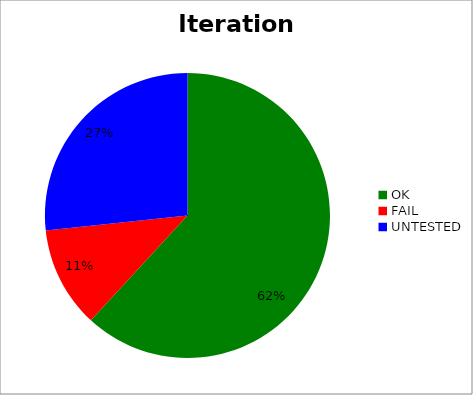
| Category | Iteration1 |
|---|---|
| OK | 0.619 |
| FAIL | 0.115 |
| UNTESTED | 0.267 |